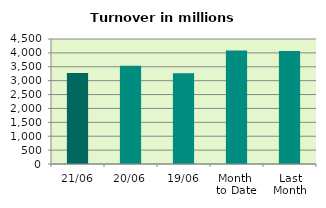
| Category | Series 0 |
|---|---|
| 21/06 | 3276.317 |
| 20/06 | 3533.281 |
| 19/06 | 3269.44 |
| Month 
to Date | 4082.037 |
| Last
Month | 4067.502 |